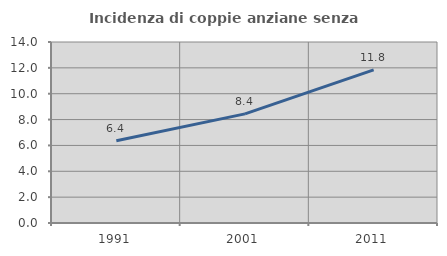
| Category | Incidenza di coppie anziane senza figli  |
|---|---|
| 1991.0 | 6.364 |
| 2001.0 | 8.442 |
| 2011.0 | 11.842 |